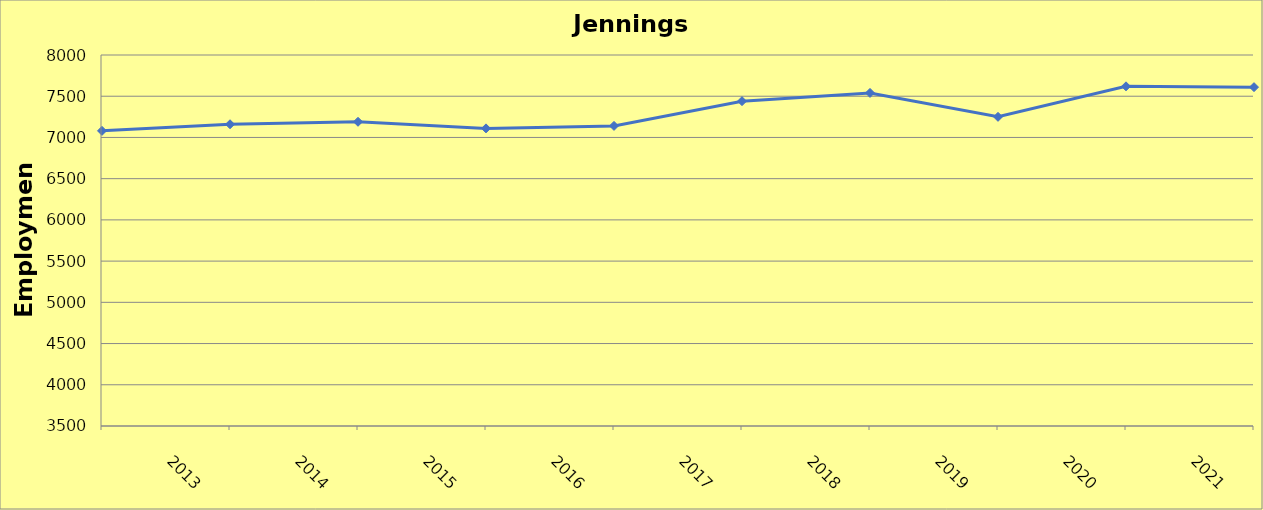
| Category | Jennings County |
|---|---|
| 2013.0 | 7080 |
| 2014.0 | 7160 |
| 2015.0 | 7190 |
| 2016.0 | 7110 |
| 2017.0 | 7140 |
| 2018.0 | 7440 |
| 2019.0 | 7540 |
| 2020.0 | 7250 |
| 2021.0 | 7620 |
| 2022.0 | 7610 |